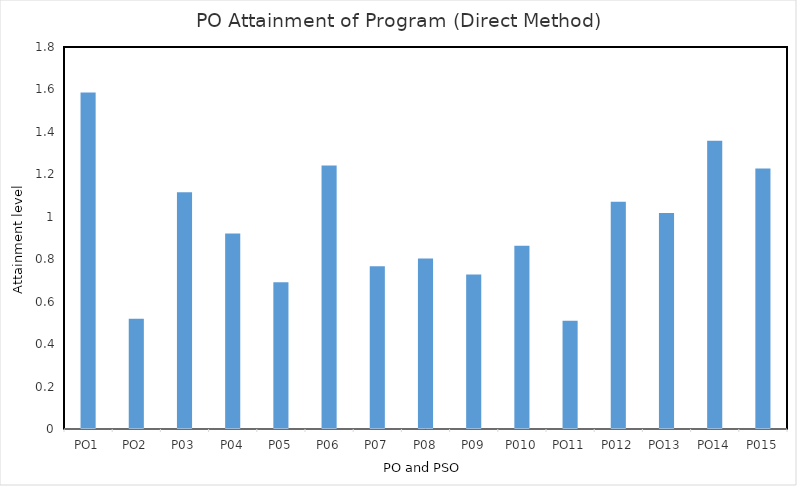
| Category | PO1 |
|---|---|
| PO1 | 1.586 |
| PO2 | 0.519 |
| P03 | 1.116 |
| P04 | 0.921 |
| P05 | 0.691 |
| P06 | 1.242 |
| P07 | 0.767 |
| P08 | 0.804 |
| P09 | 0.728 |
| P010 | 0.863 |
| PO11 | 0.51 |
| P012 | 1.07 |
| PO13 | 1.017 |
| PO14 | 1.358 |
| P015 | 1.228 |